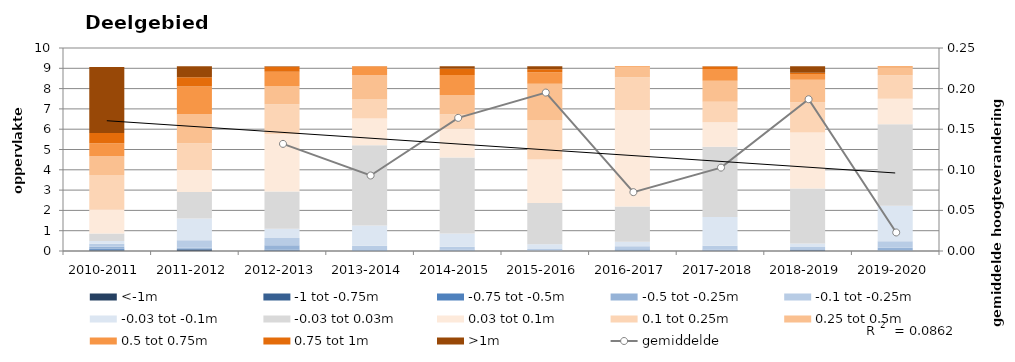
| Category | <-1m | -1 tot -0.75m | -0.75 tot -0.5m | -0.5 tot -0.25m | -0.1 tot -0.25m | -0.03 tot -0.1m | -0.03 tot 0.03m | 0.03 tot 0.1m | 0.1 tot 0.25m | 0.25 tot 0.5m | 0.5 tot 0.75m | 0.75 tot 1m | >1m |
|---|---|---|---|---|---|---|---|---|---|---|---|---|---|
| 2010-2011 | 0.023 | 0.043 | 0.047 | 0.093 | 0.157 | 0.133 | 0.368 | 1.164 | 1.716 | 0.918 | 0.649 | 0.501 | 3.256 |
| 2011-2012 | 0.066 | 0.017 | 0.026 | 0.054 | 0.367 | 1.076 | 1.3 | 1.08 | 1.324 | 1.428 | 1.372 | 0.448 | 0.547 |
| 2012-2013 | 0.015 | 0.011 | 0.036 | 0.221 | 0.358 | 0.454 | 1.836 | 2.838 | 1.454 | 0.91 | 0.691 | 0.246 | 0.034 |
| 2013-2014 | 0 | 0 | 0 | 0.044 | 0.217 | 0.997 | 3.947 | 1.316 | 0.941 | 1.194 | 0.421 | 0.02 | 0.007 |
| 2014-2015 | 0.003 | 0.006 | 0.009 | 0.052 | 0.14 | 0.647 | 3.744 | 1.424 | 0.71 | 0.953 | 0.975 | 0.323 | 0.117 |
| 2015-2016 | 0 | 0 | 0 | 0.016 | 0.078 | 0.234 | 2.042 | 2.138 | 1.919 | 1.807 | 0.566 | 0.153 | 0.152 |
| 2016-2017 | 0.014 | 0.013 | 0.015 | 0.05 | 0.138 | 0.229 | 1.738 | 4.752 | 1.609 | 0.503 | 0.037 | 0.005 | 0.002 |
| 2017-2018 | 0.006 | 0.008 | 0.014 | 0.044 | 0.184 | 1.415 | 3.458 | 1.216 | 1.013 | 1.032 | 0.572 | 0.132 | 0.011 |
| 2018-2019 | 0.024 | 0.016 | 0.021 | 0.03 | 0.11 | 0.168 | 2.708 | 2.762 | 1.486 | 1.114 | 0.272 | 0.064 | 0.328 |
| 2019-2020 | 0 | 0.001 | 0.014 | 0.142 | 0.324 | 1.749 | 4.007 | 1.268 | 1.157 | 0.379 | 0.055 | 0.008 | 0 |